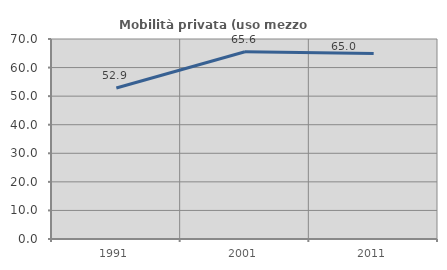
| Category | Mobilità privata (uso mezzo privato) |
|---|---|
| 1991.0 | 52.863 |
| 2001.0 | 65.551 |
| 2011.0 | 64.956 |